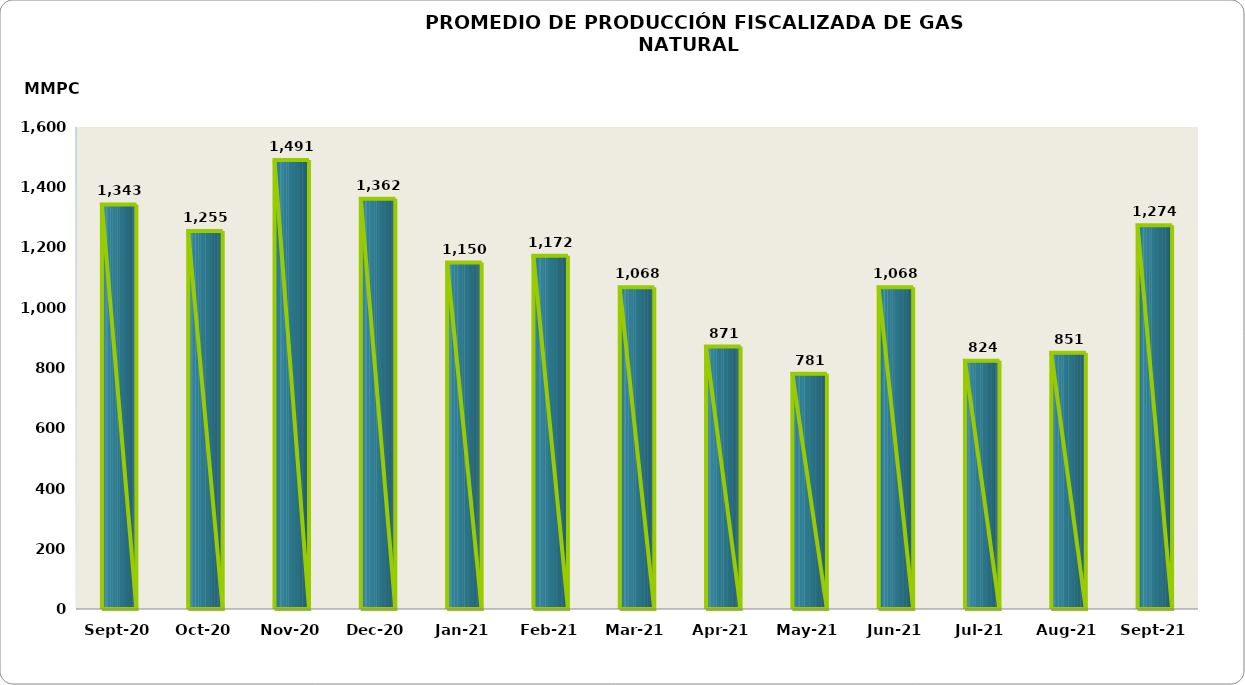
| Category | Series 0 |
|---|---|
| 2020-09-01 | 1342976.236 |
| 2020-10-01 | 1254828.351 |
| 2020-11-01 | 1490754.692 |
| 2020-12-01 | 1361515.502 |
| 2021-01-01 | 1150031.71 |
| 2021-02-01 | 1172289.733 |
| 2021-03-01 | 1067744.591 |
| 2021-04-01 | 871274.072 |
| 2021-05-01 | 780865.314 |
| 2021-06-01 | 1068128.403 |
| 2021-07-01 | 823834.105 |
| 2021-08-01 | 850929.254 |
| 2021-09-01 | 1273570.561 |